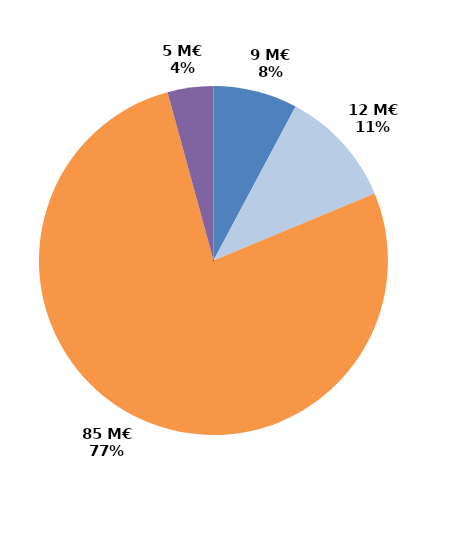
| Category | Series 0 |
|---|---|
| CIF - CPF | 8.631 |
| Période de professionnalisation | 12.107 |
| Plan de formation | 85.289 |
| Autres | 4.699 |